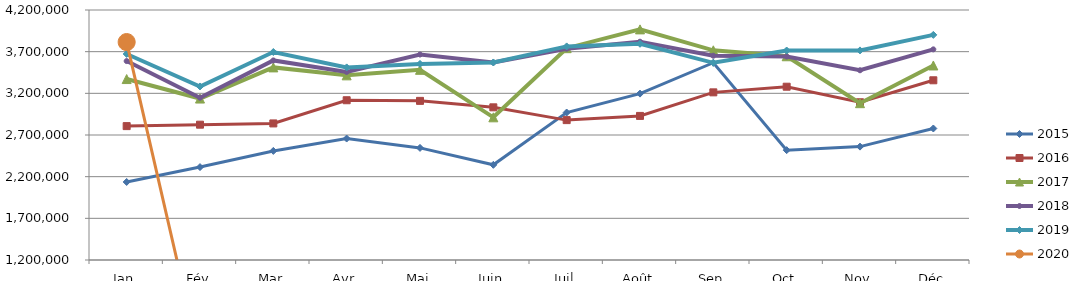
| Category | 2015 | 2016 | 2017 | 2018 | 2019 | 2020 |
|---|---|---|---|---|---|---|
| Jan | 2136502.342 | 2806589.776 | 3371394.712 | 3587233.956 | 3672518.421 | 3815073.675 |
| Fév | 2315053.514 | 2823756.288 | 3137330.791 | 3147030.186 | 3282543.846 | 0 |
| Mar | 2509043.11 | 2838870.504 | 3511145.885 | 3594630.489 | 3695934.705 | 0 |
| Avr | 2657589.53 | 3117177.085 | 3415732.63 | 3456756.804 | 3511049.816 | 0 |
| Mai | 2545128.164 | 3109551.865 | 3482213.067 | 3665518.998 | 3553093.664 | 0 |
| Juin | 2342028.041 | 3032032.74 | 2912135.998 | 3570082.41 | 3570224.807 | 0 |
| Juil | 2969663.081 | 2878621.442 | 3741770.069 | 3735197.664 | 3762976.089 | 0 |
| Août | 3196553.523 | 2928941.165 | 3967466.719 | 3819459.479 | 3794659.092 | 0 |
| Sep | 3567173.843 | 3211689.699 | 3716298.608 | 3651284.946 | 3566098.404 | 0 |
| Oct | 2518251.995 | 3279542.566 | 3644824.355 | 3642052.865 | 3713987.288 | 0 |
| Nov | 2560629.68 | 3092952.422 | 3081786.206 | 3476734.023 | 3715088.575 | 0 |
| Déc | 2778132.919 | 3356598.391 | 3534249.207 | 3727602.186 | 3901671.144 | 0 |